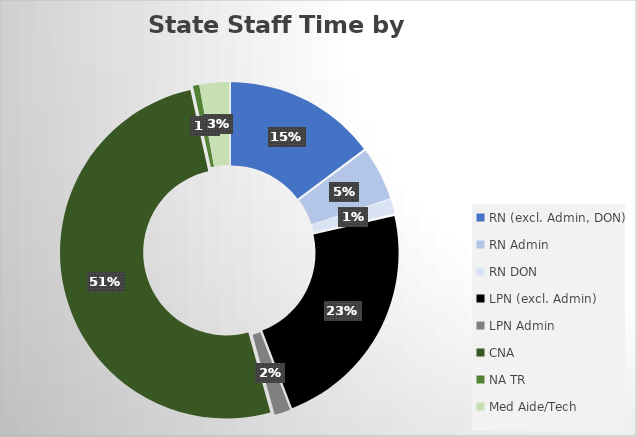
| Category | Series 0 |
|---|---|
| RN (excl. Admin, DON) | 11647.827 |
| RN Admin | 4089.552 |
| RN DON | 1141.606 |
| LPN (excl. Admin) | 17922.078 |
| LPN Admin | 1233.823 |
| CNA | 40049.393 |
| NA TR | 474.174 |
| Med Aide/Tech | 2260.141 |